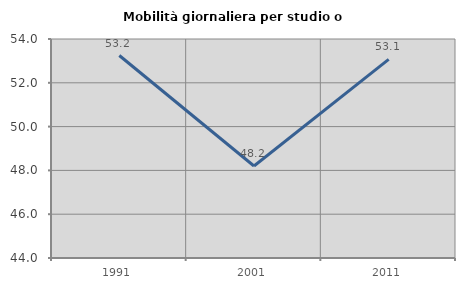
| Category | Mobilità giornaliera per studio o lavoro |
|---|---|
| 1991.0 | 53.246 |
| 2001.0 | 48.201 |
| 2011.0 | 53.068 |